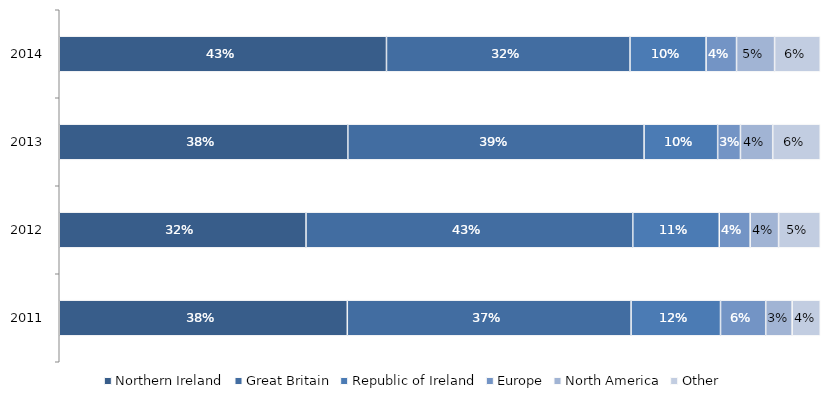
| Category | Northern Ireland | Great Britain | Republic of Ireland | Europe | North America | Other |
|---|---|---|---|---|---|---|
| 2011.0 | 0.379 | 0.373 | 0.118 | 0.059 | 0.035 | 0.037 |
| 2012.0 | 0.324 | 0.429 | 0.114 | 0.041 | 0.037 | 0.055 |
| 2013.0 | 0.38 | 0.39 | 0.097 | 0.03 | 0.042 | 0.063 |
| 2014.0 | 0.43 | 0.32 | 0.1 | 0.04 | 0.05 | 0.06 |